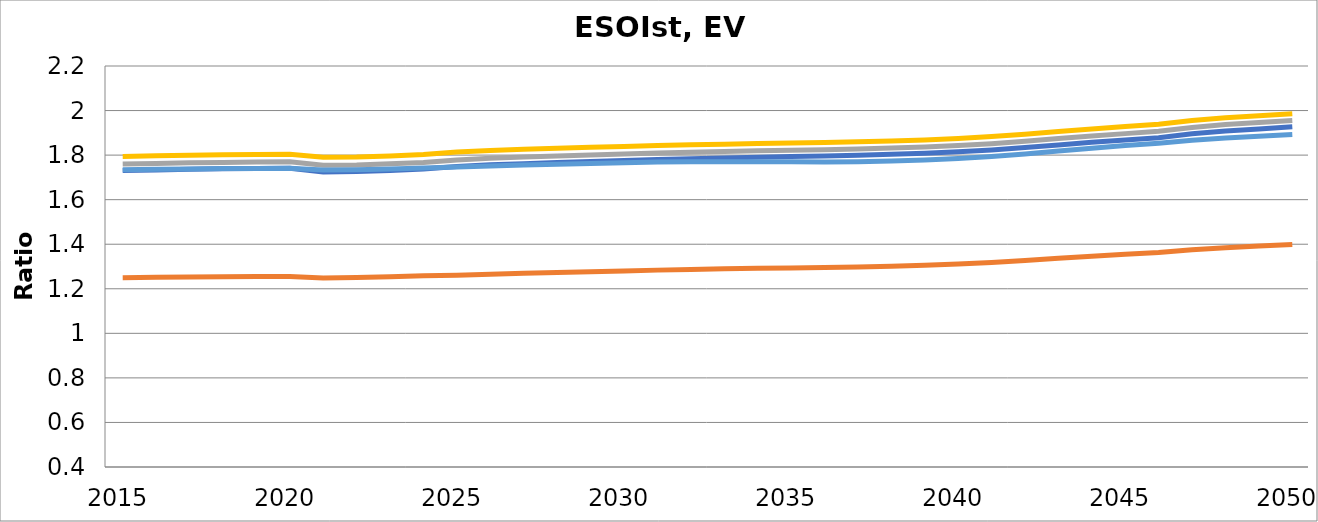
| Category |  ESOIst [LMO] |  ESOIst [NMC622] |  ESOIst [NMC811] |  ESOIst [NCA] |  ESOIst [LFP] |
|---|---|---|---|---|---|
| 2015.0 | 1.25 | 1.731 | 1.76 | 1.794 | 1.734 |
| 2016.0 | 1.252 | 1.734 | 1.763 | 1.797 | 1.736 |
| 2017.0 | 1.253 | 1.736 | 1.765 | 1.8 | 1.738 |
| 2018.0 | 1.254 | 1.738 | 1.767 | 1.802 | 1.74 |
| 2019.0 | 1.255 | 1.74 | 1.769 | 1.803 | 1.74 |
| 2020.0 | 1.255 | 1.741 | 1.77 | 1.804 | 1.741 |
| 2021.0 | 1.249 | 1.725 | 1.755 | 1.791 | 1.733 |
| 2022.0 | 1.251 | 1.726 | 1.756 | 1.792 | 1.734 |
| 2023.0 | 1.254 | 1.731 | 1.761 | 1.797 | 1.738 |
| 2024.0 | 1.258 | 1.738 | 1.767 | 1.803 | 1.742 |
| 2025.0 | 1.261 | 1.749 | 1.778 | 1.813 | 1.746 |
| 2026.0 | 1.266 | 1.756 | 1.786 | 1.821 | 1.751 |
| 2027.0 | 1.269 | 1.762 | 1.791 | 1.826 | 1.755 |
| 2028.0 | 1.273 | 1.767 | 1.796 | 1.83 | 1.759 |
| 2029.0 | 1.276 | 1.771 | 1.801 | 1.835 | 1.762 |
| 2030.0 | 1.28 | 1.776 | 1.805 | 1.839 | 1.766 |
| 2031.0 | 1.284 | 1.78 | 1.809 | 1.843 | 1.769 |
| 2032.0 | 1.287 | 1.784 | 1.813 | 1.846 | 1.77 |
| 2033.0 | 1.289 | 1.787 | 1.816 | 1.849 | 1.77 |
| 2034.0 | 1.292 | 1.791 | 1.819 | 1.852 | 1.77 |
| 2035.0 | 1.294 | 1.794 | 1.822 | 1.854 | 1.77 |
| 2036.0 | 1.295 | 1.796 | 1.824 | 1.856 | 1.769 |
| 2037.0 | 1.298 | 1.8 | 1.828 | 1.859 | 1.77 |
| 2038.0 | 1.301 | 1.804 | 1.831 | 1.863 | 1.773 |
| 2039.0 | 1.305 | 1.808 | 1.836 | 1.868 | 1.778 |
| 2040.0 | 1.311 | 1.815 | 1.843 | 1.875 | 1.785 |
| 2041.0 | 1.318 | 1.823 | 1.851 | 1.883 | 1.793 |
| 2042.0 | 1.327 | 1.834 | 1.862 | 1.894 | 1.805 |
| 2043.0 | 1.337 | 1.846 | 1.874 | 1.906 | 1.818 |
| 2044.0 | 1.346 | 1.857 | 1.886 | 1.917 | 1.831 |
| 2045.0 | 1.355 | 1.868 | 1.896 | 1.928 | 1.843 |
| 2046.0 | 1.363 | 1.878 | 1.907 | 1.938 | 1.853 |
| 2047.0 | 1.375 | 1.895 | 1.924 | 1.955 | 1.867 |
| 2048.0 | 1.385 | 1.909 | 1.937 | 1.968 | 1.877 |
| 2049.0 | 1.392 | 1.917 | 1.946 | 1.976 | 1.885 |
| 2050.0 | 1.399 | 1.927 | 1.956 | 1.986 | 1.893 |